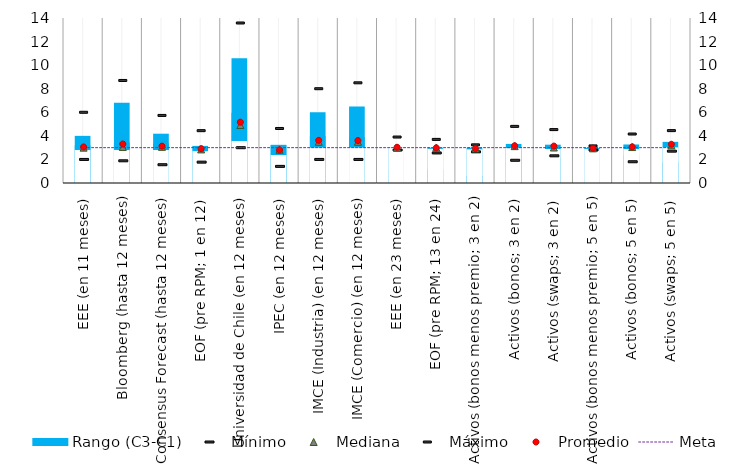
| Category | Rango (C3-C1) |
|---|---|
| EEE (en 11 meses) | 4 |
| Bloomberg (hasta 12 meses) | 6.817 |
| Consensus Forecast (hasta 12 meses) | 4.183 |
| EOF (pre RPM; 1 en 12) | 2.67 |
| Universidad de Chile (en 12 meses) | 10.58 |
| IPEC (en 12 meses) | 3.216 |
| IMCE (Industria) (en 12 meses) | 6 |
| IMCE (Comercio) (en 12 meses) | 6.5 |
| EEE (en 23 meses) | 1.1 |
| EOF (pre RPM; 13 en 24) | 1.15 |
| Activos (bonos menos premio; 3 en 2) | 0.591 |
| Activos (bonos; 3 en 2) | 2.876 |
| Activos (swaps; 3 en 2) | 2.225 |
| Activos (bonos menos premio; 5 en 5) | 0.348 |
| Activos (bonos; 5 en 5) | 2.353 |
| Activos (swaps; 5 en 5) | 1.743 |